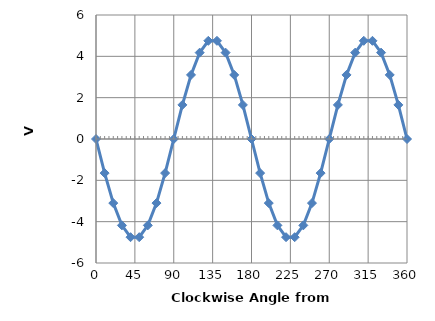
| Category | Series 0 |
|---|---|
| 0.0 | 0 |
| 10.0 | -1.65 |
| 20.0 | -3.101 |
| 30.0 | -4.178 |
| 40.0 | -4.751 |
| 50.0 | -4.751 |
| 60.0 | -4.178 |
| 70.0 | -3.101 |
| 80.0 | -1.65 |
| 90.0 | 0 |
| 100.0 | 1.65 |
| 110.0 | 3.101 |
| 120.0 | 4.178 |
| 130.0 | 4.751 |
| 140.0 | 4.751 |
| 150.0 | 4.178 |
| 160.0 | 3.101 |
| 170.0 | 1.65 |
| 180.0 | 0 |
| 190.0 | -1.65 |
| 200.0 | -3.101 |
| 210.0 | -4.178 |
| 220.0 | -4.751 |
| 230.0 | -4.751 |
| 240.0 | -4.178 |
| 250.0 | -3.101 |
| 260.0 | -1.65 |
| 270.0 | 0 |
| 280.0 | 1.65 |
| 290.0 | 3.101 |
| 300.0 | 4.178 |
| 310.0 | 4.751 |
| 320.0 | 4.751 |
| 330.0 | 4.178 |
| 340.0 | 3.101 |
| 350.0 | 1.65 |
| 360.0 | 0 |